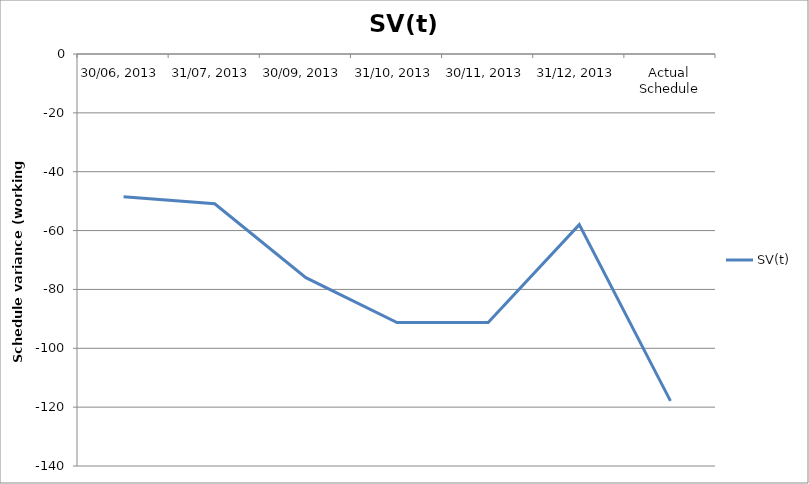
| Category | SV(t) |
|---|---|
| 30/06, 2013 | -48.5 |
| 31/07, 2013 | -50.875 |
| 30/09, 2013 | -76 |
| 31/10, 2013 | -91.25 |
| 30/11, 2013 | -91.25 |
| 31/12, 2013 | -58 |
| Actual Schedule | -117.875 |